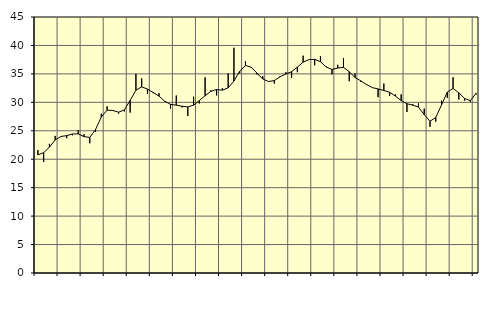
| Category | Piggar | Series 1 |
|---|---|---|
| nan | 21.6 | 20.76 |
| 1.0 | 19.5 | 21.16 |
| 1.0 | 22.7 | 22.12 |
| 1.0 | 24.1 | 23.4 |
| nan | 24 | 24 |
| 2.0 | 23.7 | 24.14 |
| 2.0 | 24.2 | 24.44 |
| 2.0 | 25.1 | 24.46 |
| nan | 24.4 | 23.97 |
| 3.0 | 22.8 | 23.83 |
| 3.0 | 24.8 | 25.22 |
| 3.0 | 28 | 27.42 |
| nan | 29.3 | 28.63 |
| 4.0 | 28.5 | 28.56 |
| 4.0 | 28 | 28.27 |
| 4.0 | 28.4 | 28.67 |
| nan | 28.2 | 30.34 |
| 5.0 | 35 | 32.12 |
| 5.0 | 34.2 | 32.72 |
| 5.0 | 31.5 | 32.33 |
| nan | 31.6 | 31.73 |
| 6.0 | 31.6 | 31.1 |
| 6.0 | 30.1 | 30.19 |
| 6.0 | 28.9 | 29.65 |
| nan | 31.2 | 29.5 |
| 7.0 | 29.1 | 29.31 |
| 7.0 | 27.6 | 29.19 |
| 7.0 | 31 | 29.5 |
| nan | 29.8 | 30.31 |
| 8.0 | 34.4 | 31.16 |
| 8.0 | 32.1 | 31.94 |
| 8.0 | 31.2 | 32.25 |
| nan | 32.5 | 32.14 |
| 9.0 | 35.1 | 32.54 |
| 9.0 | 39.6 | 33.74 |
| 9.0 | 35.1 | 35.48 |
| nan | 37.2 | 36.48 |
| 10.0 | 36.1 | 36.17 |
| 10.0 | 34.9 | 35.13 |
| 10.0 | 34.6 | 34.1 |
| nan | 33.7 | 33.66 |
| 11.0 | 33.3 | 33.82 |
| 11.0 | 34.6 | 34.49 |
| 11.0 | 35.3 | 34.99 |
| nan | 34.3 | 35.39 |
| 12.0 | 35.3 | 36.2 |
| 12.0 | 38.2 | 37.06 |
| 12.0 | 37.5 | 37.51 |
| nan | 36.5 | 37.55 |
| 13.0 | 38.1 | 37.14 |
| 13.0 | 36.3 | 36.22 |
| 13.0 | 34.9 | 35.78 |
| nan | 36.6 | 36.03 |
| 14.0 | 37.8 | 36.14 |
| 14.0 | 33.7 | 35.38 |
| 14.0 | 35.1 | 34.36 |
| nan | 33.6 | 33.78 |
| 15.0 | 33.2 | 33.11 |
| 15.0 | 32.6 | 32.59 |
| 15.0 | 30.9 | 32.35 |
| nan | 33.3 | 32.08 |
| 16.0 | 31.1 | 31.77 |
| 16.0 | 31.4 | 31.11 |
| 16.0 | 31.4 | 30.31 |
| nan | 28.3 | 29.75 |
| 17.0 | 29.7 | 29.51 |
| 17.0 | 29.8 | 29.17 |
| 17.0 | 28.9 | 27.85 |
| nan | 25.7 | 26.67 |
| 18.0 | 26.6 | 27.33 |
| 18.0 | 30.3 | 29.54 |
| 18.0 | 30.8 | 31.79 |
| nan | 34.4 | 32.44 |
| 19.0 | 30.5 | 31.67 |
| 19.0 | 30.3 | 30.68 |
| 19.0 | 30.1 | 30.3 |
| nan | 31.4 | 31.59 |